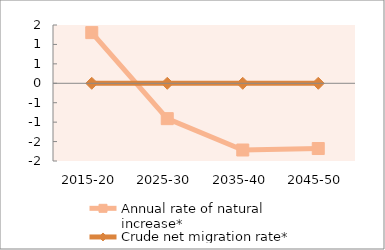
| Category | Annual rate of natural increase* | Crude net migration rate* |
|---|---|---|
| 2015-20 | 1.304 | 0 |
| 2025-30 | -0.91 | 0 |
| 2035-40 | -1.717 | 0 |
| 2045-50 | -1.679 | 0 |